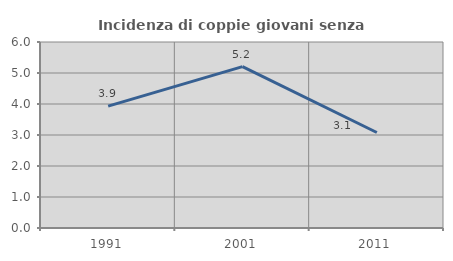
| Category | Incidenza di coppie giovani senza figli |
|---|---|
| 1991.0 | 3.932 |
| 2001.0 | 5.204 |
| 2011.0 | 3.08 |